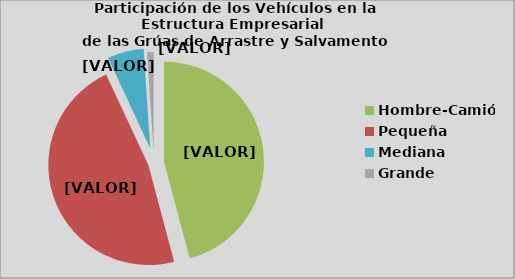
| Category | Series 0 |
|---|---|
| Hombre-Camión | 45.845 |
| Pequeña | 47.214 |
| Mediana | 5.88 |
| Grande | 1.062 |